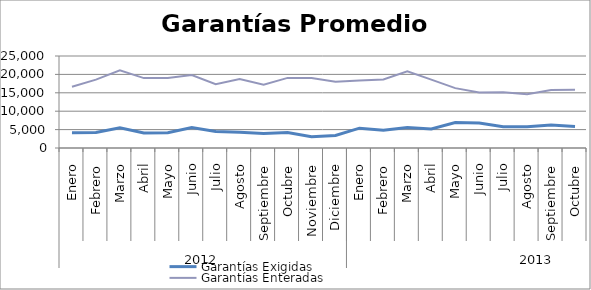
| Category | Garantías Exigidas | Garantías Enteradas |
|---|---|---|
| 0 | 4146.8 | 16662.483 |
| 1 | 4190.531 | 18572.749 |
| 2 | 5482.211 | 21128.648 |
| 3 | 4079.038 | 18997.51 |
| 4 | 4141.554 | 19005.364 |
| 5 | 5549.139 | 19818.91 |
| 6 | 4487.023 | 17351.39 |
| 7 | 4277.924 | 18719.955 |
| 8 | 3940.893 | 17217.403 |
| 9 | 4180.69 | 19046.939 |
| 10 | 3056.997 | 19028.425 |
| 11 | 3426.799 | 17994.819 |
| 12 | 5390.461 | 18317.043 |
| 13 | 4807.91 | 18608.477 |
| 14 | 5582.739 | 20850.446 |
| 15 | 5196.755 | 18583.166 |
| 16 | 6912.615 | 16266.455 |
| 17 | 6790.981 | 15108.06 |
| 18 | 5787.122 | 15161.964 |
| 19 | 5780.082 | 14588.597 |
| 20 | 6263.345 | 15743.621 |
| 21 | 5845.053 | 15824.978 |